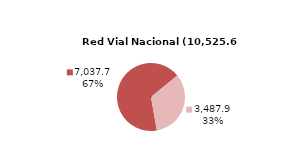
| Category | RV Nacional |
|---|---|
| Pavimentada | 7037.674 |
| No Pavimentada | 3487.941 |